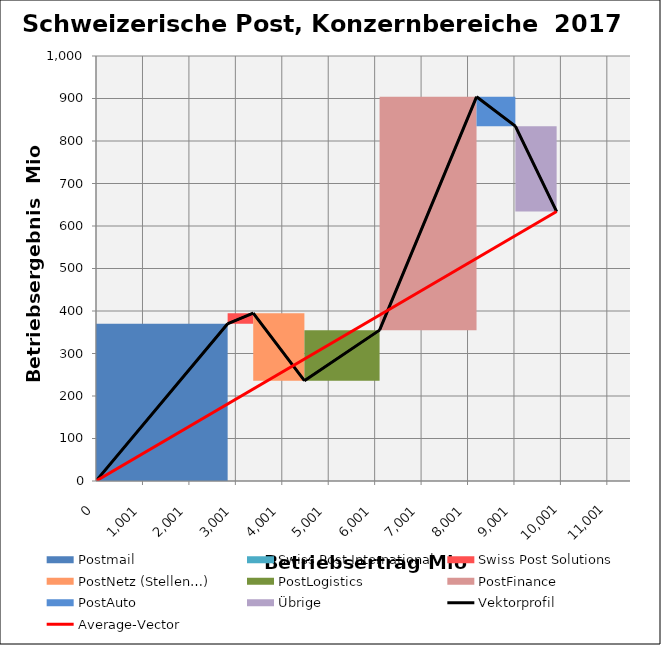
| Category | transparent | Postmail | Swiss Post International | Swiss Post Solutions | PostNetz (Stellen…) | PostLogistics | PostFinance | PostAuto | Übrige | Border right & top |
|---|---|---|---|---|---|---|---|---|---|---|
| 0.0 | 0 | 370 | 0 | 0 | 0 | 0 | 0 | 0 | 0 | 0 |
| 2835.0 | 0 | 370 | 0 | 0 | 0 | 0 | 0 | 0 | 0 | 0 |
| 2835.0 | 370 | 0 | 0 | 0 | 0 | 0 | 0 | 0 | 0 | 0 |
| 2835.0 | 370 | 0 | 0 | 0 | 0 | 0 | 0 | 0 | 0 | 0 |
| 2835.0 | 370 | 0 | 0 | 25 | 0 | 0 | 0 | 0 | 0 | 0 |
| 3386.0 | 370 | 0 | 0 | 25 | 0 | 0 | 0 | 0 | 0 | 0 |
| 3386.0 | 395 | 0 | 0 | 0 | -159 | 0 | 0 | 0 | 0 | 0 |
| 4488.0 | 395 | 0 | 0 | 0 | -159 | 0 | 0 | 0 | 0 | 0 |
| 4488.0 | 236 | 0 | 0 | 0 | 0 | 119 | 0 | 0 | 0 | 0 |
| 6107.0 | 236 | 0 | 0 | 0 | 0 | 119 | 0 | 0 | 0 | 0 |
| 6107.0 | 355 | 0 | 0 | 0 | 0 | 0 | 549 | 0 | 0 | 0 |
| 8195.0 | 355 | 0 | 0 | 0 | 0 | 0 | 549 | 0 | 0 | 0 |
| 8195.0 | 904 | 0 | 0 | 0 | 0 | 0 | 0 | -69 | 0 | 0 |
| 9031.0 | 904 | 0 | 0 | 0 | 0 | 0 | 0 | -69 | 0 | 0 |
| 9031.0 | 835 | 0 | 0 | 0 | 0 | 0 | 0 | 0 | -201 | 0 |
| 9920.0 | 835 | 0 | 0 | 0 | 0 | 0 | 0 | 0 | -201 | 0 |
| 9920.0 | 634 | 0 | 0 | 0 | 0 | 0 | 0 | 0 | 0 | 0 |
| 9920.0 | 634 | 0 | 0 | 0 | 0 | 0 | 0 | 0 | 0 | 0 |
| 9920.0 | 634 | 0 | 0 | 0 | 0 | 0 | 0 | 0 | 0 | 0 |
| 9920.0 | 634 | 0 | 0 | 0 | 0 | 0 | 0 | 0 | 0 | 0 |
| 9920.0 | 634 | 0 | 0 | 0 | 0 | 0 | 0 | 0 | 0 | 200 |
| 11500.0 | 634 | 0 | 0 | 0 | 0 | 0 | 0 | 0 | 0 | 200 |
| 11500.0 | 634 | 0 | 0 | 0 | 0 | 0 | 0 | 0 | 0 | 200 |